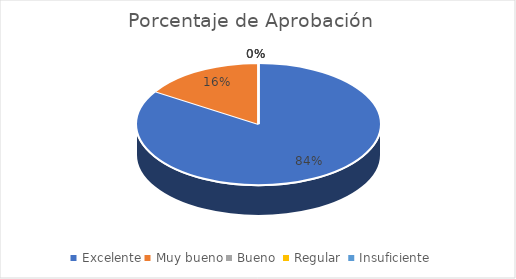
| Category | Porcentaje de Aprobación  |
|---|---|
| Excelente | 0.84 |
| Muy bueno | 0.16 |
| Bueno  | 0 |
| Regular  | 0 |
| Insuficiente | 0 |